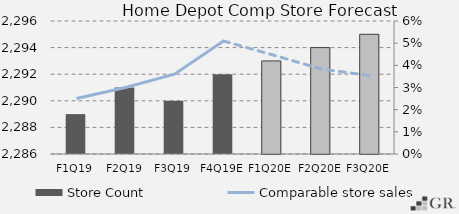
| Category | Store Count  |
|---|---|
|  F1Q19  | 2289 |
|  F2Q19  | 2291 |
|  F3Q19  | 2290 |
|  F4Q19E  | 2292 |
|  F1Q20E  | 2293 |
|  F2Q20E  | 2294 |
|  F3Q20E  | 2295 |